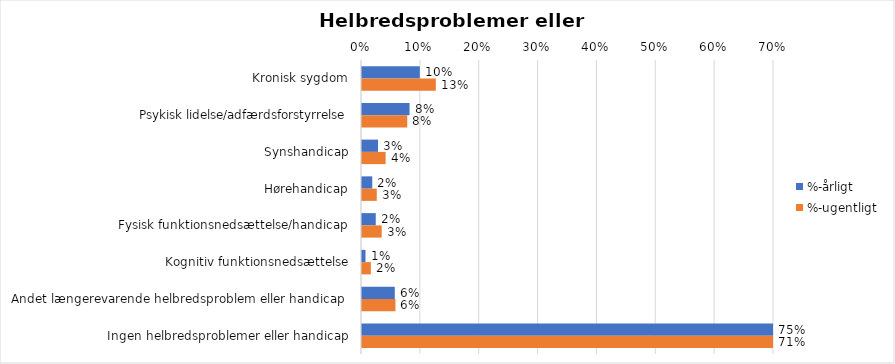
| Category | %-årligt | %-ugentligt |
|---|---|---|
| Kronisk sygdom | 0.098 | 0.125 |
| Psykisk lidelse/adfærdsforstyrrelse | 0.081 | 0.077 |
| Synshandicap | 0.027 | 0.04 |
| Hørehandicap | 0.017 | 0.025 |
| Fysisk funktionsnedsættelse/handicap | 0.023 | 0.033 |
| Kognitiv funktionsnedsættelse | 0.006 | 0.015 |
| Andet længerevarende helbredsproblem eller handicap  | 0.056 | 0.057 |
| Ingen helbredsproblemer eller handicap | 0.746 | 0.706 |